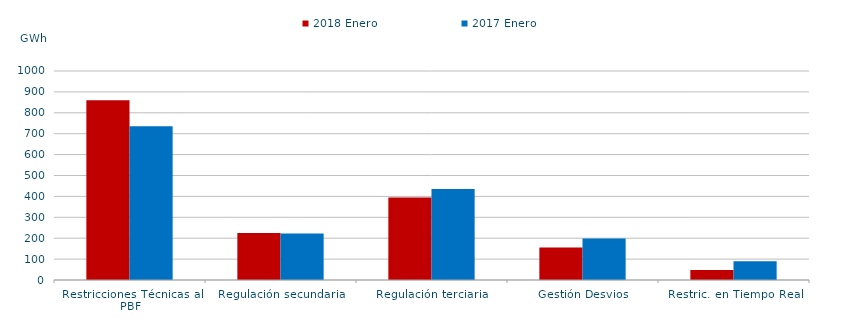
| Category | 2018 | 2017 |
|---|---|---|
| Restricciones Técnicas al PBF | 860.569 | 735.048 |
| Regulación secundaria | 224.889 | 222.14 |
| Regulación terciaria | 394.832 | 435.085 |
| Gestión Desvios | 155.133 | 198.603 |
| Restric. en Tiempo Real | 48.012 | 90.308 |